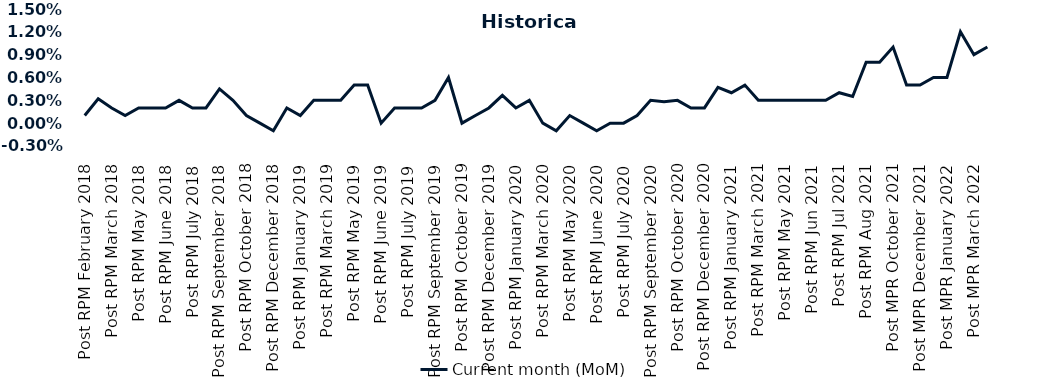
| Category | Current month (MoM)  |
|---|---|
| Post RPM February 2018 | 0.001 |
| Pre RPM March 2018 | 0.003 |
| Post RPM March 2018 | 0.002 |
| Pre RPM May 2018 | 0.001 |
| Post RPM May 2018 | 0.002 |
| Pre RPM June 2018 | 0.002 |
| Post RPM June 2018 | 0.002 |
| Pre RPM July 2018 | 0.003 |
| Post RPM July 2018 | 0.002 |
| Pre RPM September 2018 | 0.002 |
| Post RPM September 2018 | 0.004 |
| Pre RPM October 2018 | 0.003 |
| Post RPM October 2018 | 0.001 |
| Pre RPM December 2018 | 0 |
| Post RPM December 2018 | -0.001 |
| Pre RPM January 2019 | 0.002 |
| Post RPM January 2019 | 0.001 |
| Pre RPM March 2019 | 0.003 |
| Post RPM March 2019 | 0.003 |
| Pre RPM May 2019 | 0.003 |
| Post RPM May 2019 | 0.005 |
| Pre RPM June 2019 | 0.005 |
| Post RPM June 2019 | 0 |
| Pre RPM July 2019 | 0.002 |
| Post RPM July 2019 | 0.002 |
| Pre RPM September 2019 | 0.002 |
| Post RPM September 2019 | 0.003 |
| Pre RPM October 2019 | 0.006 |
| Post RPM October 2019 | 0 |
| Pre RPM December 2019 | 0.001 |
| Post RPM December 2019 | 0.002 |
| Pre RPM January 2020 | 0.004 |
| Post RPM January 2020 | 0.002 |
| Pre RPM March 2020 | 0.003 |
| Post RPM March 2020 | 0 |
| Pre RPM May 2020 | -0.001 |
| Post RPM May 2020 | 0.001 |
| Pre RPM June 2020 | 0 |
| Post RPM June 2020 | -0.001 |
| Pre RPM July 2020 | 0 |
| Post RPM July 2020 | 0 |
| Pre RPM September 2020 | 0.001 |
| Post RPM September 2020 | 0.003 |
| Pre RPM October 2020 | 0.003 |
| Post RPM October 2020 | 0.003 |
| Pre RPM December 2020 | 0.002 |
|  Post RPM December 2020 | 0.002 |
| Pre RPM January 2021 | 0.005 |
| Post RPM January 2021 | 0.004 |
|  Pre RPM March 2021 | 0.005 |
|  Post RPM March 2021 | 0.003 |
|  Pre RPM May 2021 | 0.003 |
|  Post RPM May 2021 | 0.003 |
|  Pre RPM Jun 2021 | 0.003 |
|   Post RPM Jun 2021 | 0.003 |
| Pre RPM Jul 2021 | 0.003 |
|  Post RPM Jul 2021 | 0.004 |
| Pre RPM Aug 2021 | 0.004 |
|  Post RPM Aug 2021 | 0.008 |
| Pre MPR October 2021 | 0.008 |
| Post MPR October 2021 | 0.01 |
| Pre MPR December 2021 | 0.005 |
| Post MPR December 2021 | 0.005 |
| Pre MPR January 2022 | 0.006 |
| Post MPR January 2022 | 0.006 |
| Pre MPR March 2022 | 0.012 |
| Post MPR March 2022 | 0.009 |
| Pre MPR May 2022 | 0.01 |